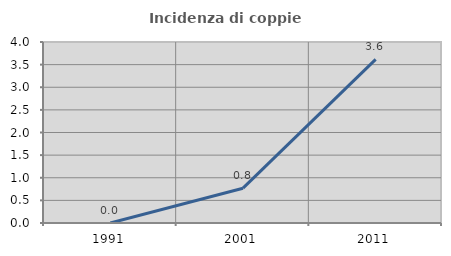
| Category | Incidenza di coppie miste |
|---|---|
| 1991.0 | 0 |
| 2001.0 | 0.769 |
| 2011.0 | 3.616 |